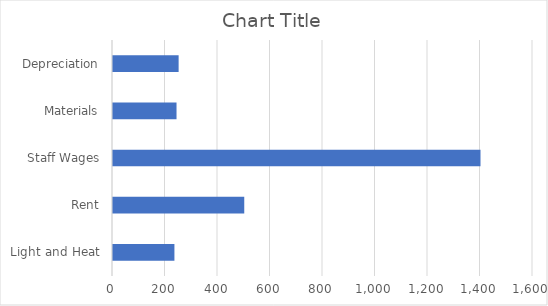
| Category | Series 0 |
|---|---|
| Light and Heat | 234 |
| Rent | 500 |
| Staff Wages | 1400 |
| Materials | 242 |
| Depreciation | 250 |